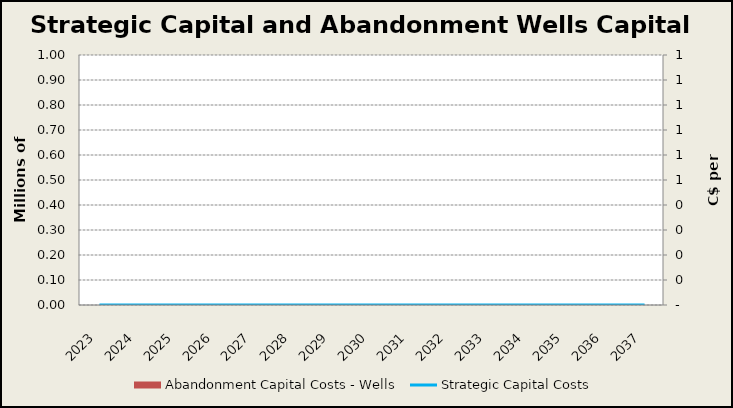
| Category | Abandonment Capital Costs - Wells |
|---|---|
| 2023.0 | 0 |
| 2024.0 | 0 |
| 2025.0 | 0 |
| 2026.0 | 0 |
| 2027.0 | 0 |
| 2028.0 | 0 |
| 2029.0 | 0 |
| 2030.0 | 0 |
| 2031.0 | 0 |
| 2032.0 | 0 |
| 2033.0 | 0 |
| 2034.0 | 0 |
| 2035.0 | 0 |
| 2036.0 | 0 |
| 2037.0 | 0 |